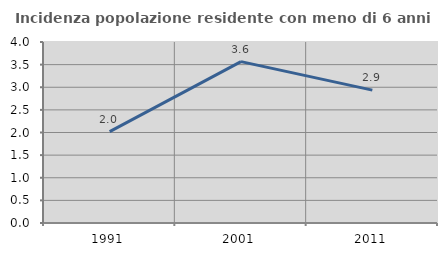
| Category | Incidenza popolazione residente con meno di 6 anni |
|---|---|
| 1991.0 | 2.019 |
| 2001.0 | 3.566 |
| 2011.0 | 2.936 |